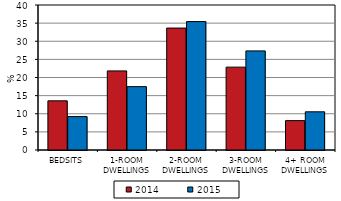
| Category | 2014 | 2015 |
|---|---|---|
| BEDSITS | 13.563 | 9.217 |
| 1-ROOM DWELLINGS | 21.816 | 17.482 |
| 2-ROOM DWELLINGS | 33.634 | 35.427 |
| 3-ROOM DWELLINGS | 22.859 | 27.338 |
| 4+ ROOM DWELLINGS | 8.1 | 10.536 |